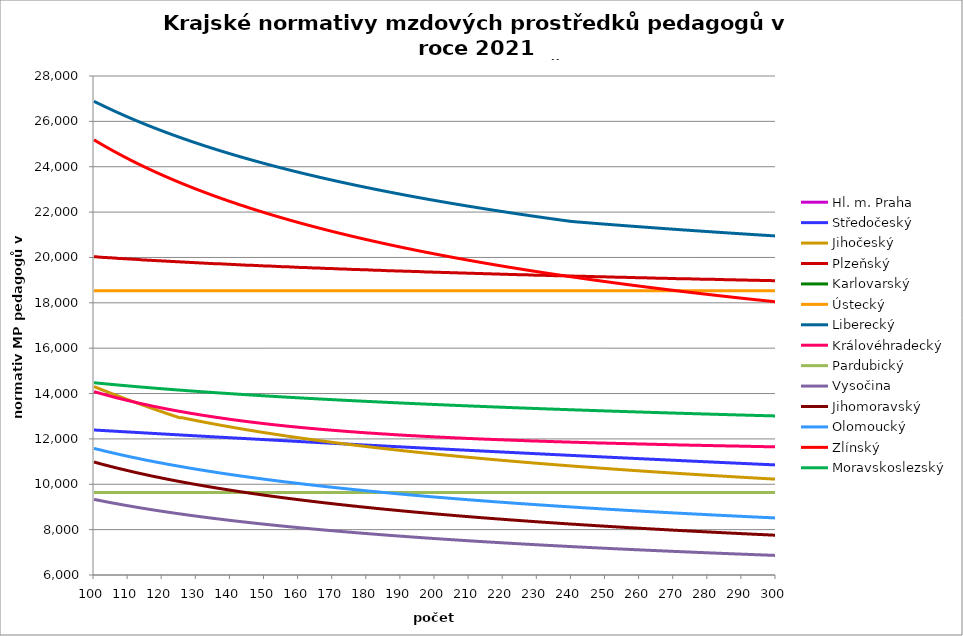
| Category | Hl. m. Praha | Středočeský | Jihočeský | Plzeňský | Karlovarský  | Ústecký   | Liberecký | Královéhradecký | Pardubický | Vysočina | Jihomoravský | Olomoucký | Zlínský | Moravskoslezský |
|---|---|---|---|---|---|---|---|---|---|---|---|---|---|---|
| 100.0 | 30242.815 | 12393.089 | 14307.025 | 20032.345 | 31680 | 18530.318 | 26885.263 | 14086.59 | 9638.914 | 9334.496 | 10981.179 | 11582.286 | 25185.836 | 14476.756 |
| 101.0 | 30242.815 | 12384.295 | 14246.784 | 20024.208 | 31680 | 18530.318 | 26810.474 | 14043.161 | 9638.914 | 9304.116 | 10940.705 | 11543.806 | 25095.861 | 14462.008 |
| 102.0 | 30242.815 | 12375.514 | 14187.047 | 20007.955 | 31680 | 18530.318 | 26736.831 | 14000 | 9638.914 | 9274.276 | 10898.027 | 11508.304 | 25007.403 | 14447.436 |
| 103.0 | 30242.815 | 12366.745 | 14127.81 | 19999.838 | 31680 | 18530.318 | 26664.304 | 13960.992 | 9638.914 | 9244.965 | 10858.162 | 11470.314 | 24920.421 | 14433.035 |
| 104.0 | 30242.815 | 12357.989 | 14069.065 | 19991.727 | 31680 | 18530.318 | 26592.865 | 13918.333 | 9638.914 | 9215.84 | 10821.053 | 11435.261 | 24834.874 | 14418.801 |
| 105.0 | 30242.815 | 12349.245 | 14010.807 | 19983.624 | 31680 | 18530.318 | 26522.485 | 13879.778 | 9638.914 | 9187.568 | 10781.748 | 11400.422 | 24750.722 | 14404.73 |
| 106.0 | 30242.815 | 12340.514 | 13953.029 | 19975.527 | 31680 | 18530.318 | 26453.139 | 13837.614 | 9638.914 | 9159.47 | 10742.728 | 11365.794 | 24667.928 | 14390.821 |
| 107.0 | 30242.815 | 12331.795 | 13895.726 | 19959.352 | 31680 | 18530.318 | 26384.801 | 13799.504 | 9638.914 | 9131.874 | 10706.402 | 11331.377 | 24586.456 | 14377.068 |
| 108.0 | 30242.815 | 12323.088 | 13838.892 | 19951.275 | 31680 | 18530.318 | 26317.445 | 13761.604 | 9638.914 | 9104.774 | 10670.321 | 11297.167 | 24506.271 | 14363.469 |
| 109.0 | 30242.815 | 12314.393 | 13782.52 | 19943.204 | 31680 | 18530.318 | 26251.049 | 13723.911 | 9638.914 | 9077.834 | 10634.483 | 11263.163 | 24427.338 | 14350.021 |
| 110.0 | 30242.815 | 12305.711 | 13726.606 | 19935.14 | 31680 | 18530.318 | 26185.589 | 13690.164 | 9638.914 | 9051.704 | 10598.884 | 11231.956 | 24349.627 | 14336.721 |
| 111.0 | 30242.815 | 12297.041 | 13671.144 | 19927.082 | 31680 | 18530.318 | 26121.042 | 13652.861 | 9638.914 | 9025.724 | 10563.523 | 11198.343 | 24273.105 | 14323.565 |
| 112.0 | 30242.815 | 12288.383 | 13616.128 | 19919.03 | 31680 | 18530.318 | 26057.388 | 13619.462 | 9638.914 | 9000.054 | 10528.397 | 11167.493 | 24197.743 | 14310.551 |
| 113.0 | 30242.815 | 12279.737 | 13561.554 | 19910.985 | 31680 | 18530.318 | 25994.604 | 13582.543 | 9638.914 | 8974.689 | 10493.504 | 11136.813 | 24123.511 | 14297.676 |
| 114.0 | 30242.815 | 12271.104 | 13507.415 | 19894.915 | 31680 | 18530.318 | 25932.672 | 13549.486 | 9638.914 | 8949.945 | 10461.145 | 11103.766 | 24050.381 | 14284.937 |
| 115.0 | 30242.815 | 12262.482 | 13453.706 | 19886.89 | 31680 | 18530.318 | 25871.571 | 13516.59 | 9638.914 | 8925.495 | 10428.986 | 11073.435 | 23978.325 | 14272.332 |
| 116.0 | 30242.815 | 12253.873 | 13400.423 | 19878.871 | 31680 | 18530.318 | 25811.283 | 13483.854 | 9638.914 | 8901.336 | 10394.747 | 11043.269 | 23907.319 | 14259.858 |
| 117.0 | 30242.815 | 12245.276 | 13347.56 | 19870.859 | 31680 | 18530.318 | 25751.789 | 13451.275 | 9638.914 | 8877.464 | 10362.994 | 11015.761 | 23837.336 | 14247.512 |
| 118.0 | 30242.815 | 12236.691 | 13295.113 | 19862.853 | 31680 | 18530.318 | 25693.071 | 13422.448 | 9638.914 | 8854.031 | 10331.434 | 10985.908 | 23768.352 | 14235.293 |
| 119.0 | 30242.815 | 12228.118 | 13243.076 | 19854.853 | 31680 | 18530.318 | 25635.113 | 13390.166 | 9638.914 | 8830.876 | 10302.299 | 10956.216 | 23700.343 | 14223.197 |
| 120.0 | 30242.815 | 12219.557 | 13191.446 | 19846.86 | 31680 | 18530.318 | 25577.897 | 13361.6 | 9638.914 | 8807.997 | 10271.107 | 10929.14 | 23633.287 | 14211.223 |
| 121.0 | 30242.815 | 12211.007 | 13140.216 | 19838.873 | 31680 | 18530.318 | 25521.408 | 13329.609 | 9638.914 | 8785.389 | 10240.103 | 10899.754 | 23567.161 | 14199.369 |
| 122.0 | 30242.815 | 12202.47 | 13089.382 | 19830.893 | 31680 | 18530.318 | 25465.63 | 13301.301 | 9638.914 | 8763.202 | 10211.481 | 10872.955 | 23501.943 | 14187.631 |
| 123.0 | 30242.815 | 12193.945 | 13038.94 | 19822.919 | 31680 | 18530.318 | 25410.547 | 13273.113 | 9638.914 | 8741.127 | 10180.836 | 10846.288 | 23437.614 | 14176.008 |
| 124.0 | 30242.815 | 12185.432 | 12988.886 | 19814.952 | 31680 | 18530.318 | 25356.145 | 13245.044 | 9638.914 | 8719.465 | 10152.544 | 10819.751 | 23374.152 | 14164.498 |
| 125.0 | 30242.815 | 12176.93 | 12939.214 | 19806.991 | 31680 | 18530.318 | 25302.41 | 13217.093 | 9638.914 | 8698.211 | 10124.408 | 10793.344 | 23311.539 | 14153.1 |
| 126.0 | 30242.815 | 12168.441 | 12929.001 | 19799.036 | 31680 | 18530.318 | 25249.328 | 13192.733 | 9638.914 | 8676.91 | 10096.429 | 10767.065 | 23249.755 | 14141.81 |
| 127.0 | 30242.815 | 12159.963 | 12897.924 | 19791.088 | 31680 | 18530.318 | 25196.885 | 13165.003 | 9638.914 | 8656.161 | 10068.603 | 10740.914 | 23188.782 | 14130.627 |
| 128.0 | 30242.815 | 12151.497 | 12867.238 | 19783.146 | 31680 | 18530.318 | 25145.068 | 13137.389 | 9638.914 | 8635.51 | 10040.93 | 10714.89 | 23128.603 | 14119.549 |
| 129.0 | 30242.815 | 12143.043 | 12836.936 | 19775.211 | 31680 | 18530.318 | 25093.864 | 13113.321 | 9638.914 | 8615.105 | 10013.409 | 10688.991 | 23069.2 | 14108.575 |
| 130.0 | 30242.815 | 12134.6 | 12807.008 | 19767.281 | 31680 | 18530.318 | 25043.262 | 13089.342 | 9638.914 | 8595.237 | 9988.139 | 10665.556 | 23010.557 | 14097.702 |
| 131.0 | 30242.815 | 12126.17 | 12777.446 | 19759.359 | 31680 | 18530.318 | 24993.248 | 13065.45 | 9638.914 | 8575.168 | 9960.906 | 10639.895 | 22952.657 | 14086.929 |
| 132.0 | 30242.815 | 12117.751 | 12748.245 | 19751.442 | 31680 | 18530.318 | 24943.813 | 13038.251 | 9638.914 | 8555.629 | 9935.9 | 10616.674 | 22895.485 | 14076.254 |
| 133.0 | 30242.815 | 12109.343 | 12719.395 | 19743.532 | 31680 | 18530.318 | 24894.943 | 13017.927 | 9638.914 | 8536.324 | 9908.951 | 10591.248 | 22839.025 | 14065.676 |
| 134.0 | 30242.815 | 12100.948 | 12690.89 | 19735.629 | 31680 | 18530.318 | 24846.628 | 12994.295 | 9638.914 | 8517.25 | 9884.204 | 10568.238 | 22783.262 | 14055.193 |
| 135.0 | 30242.815 | 12092.564 | 12662.723 | 19727.731 | 31680 | 18530.318 | 24798.858 | 12970.748 | 9638.914 | 8498.26 | 9859.581 | 10545.328 | 22728.183 | 14044.803 |
| 136.0 | 30242.815 | 12084.191 | 12634.888 | 19719.84 | 31680 | 18530.318 | 24751.621 | 12947.287 | 9638.914 | 8479.641 | 9835.08 | 10520.242 | 22673.773 | 14034.505 |
| 137.0 | 30242.815 | 12075.83 | 12607.377 | 19719.84 | 31680 | 18530.318 | 24704.908 | 12927.245 | 9638.914 | 8461.246 | 9810.7 | 10497.54 | 22620.019 | 14024.297 |
| 138.0 | 30242.815 | 12067.481 | 12580.185 | 19711.955 | 31680 | 18530.318 | 24658.709 | 12903.94 | 9638.914 | 8442.93 | 9786.441 | 10474.935 | 22566.907 | 14014.179 |
| 139.0 | 30242.815 | 12059.143 | 12553.304 | 19704.077 | 31680 | 18530.318 | 24613.014 | 12884.032 | 9638.914 | 8424.835 | 9762.302 | 10452.428 | 22514.425 | 14004.147 |
| 140.0 | 30242.815 | 12050.817 | 12526.73 | 19696.205 | 31680 | 18530.318 | 24567.814 | 12860.883 | 9638.914 | 8406.958 | 9738.282 | 10430.017 | 22462.56 | 13994.202 |
| 141.0 | 30242.815 | 12042.502 | 12500.456 | 19688.339 | 31680 | 18530.318 | 24523.1 | 12841.107 | 9638.914 | 8389.296 | 9716.367 | 10409.929 | 22411.3 | 13984.342 |
| 142.0 | 30242.815 | 12034.199 | 12474.477 | 19680.479 | 31680 | 18530.318 | 24478.862 | 12821.392 | 9638.914 | 8371.986 | 9692.571 | 10387.7 | 22360.633 | 13974.565 |
| 143.0 | 30242.815 | 12025.907 | 12448.786 | 19672.626 | 31680 | 18530.318 | 24435.093 | 12801.737 | 9638.914 | 8354.609 | 9668.893 | 10365.566 | 22310.548 | 13964.87 |
| 144.0 | 30242.815 | 12017.627 | 12423.379 | 19664.779 | 31680 | 18530.318 | 24391.783 | 12782.143 | 9638.914 | 8337.719 | 9647.288 | 10345.725 | 22261.034 | 13955.256 |
| 145.0 | 30242.815 | 12009.358 | 12398.25 | 19656.938 | 31680 | 18530.318 | 24348.924 | 12762.608 | 9638.914 | 8320.759 | 9625.78 | 10323.769 | 22212.079 | 13945.722 |
| 146.0 | 30242.815 | 12001.1 | 12373.394 | 19656.938 | 31680 | 18530.318 | 24306.509 | 12743.133 | 9638.914 | 8304.143 | 9602.426 | 10304.088 | 22163.673 | 13936.266 |
| 147.0 | 30242.815 | 11992.854 | 12348.807 | 19649.103 | 31680 | 18530.318 | 24264.529 | 12726.949 | 9638.914 | 8287.592 | 9581.118 | 10282.308 | 22115.806 | 13926.887 |
| 148.0 | 30242.815 | 11984.619 | 12324.482 | 19641.275 | 31680 | 18530.318 | 24222.978 | 12707.583 | 9638.914 | 8271.243 | 9559.903 | 10262.785 | 22068.468 | 13917.585 |
| 149.0 | 30242.815 | 11976.395 | 12300.417 | 19633.453 | 31680 | 18530.318 | 24181.846 | 12691.489 | 9638.914 | 8255.094 | 9538.783 | 10243.335 | 22021.649 | 13908.357 |
| 150.0 | 30242.815 | 11968.183 | 12276.605 | 19625.637 | 31680 | 18530.318 | 24141.128 | 12672.231 | 9638.914 | 8239.143 | 9517.756 | 10221.811 | 21975.339 | 13899.203 |
| 151.0 | 30242.815 | 11959.982 | 12253.042 | 19617.827 | 31680 | 18530.318 | 24100.816 | 12656.226 | 9638.914 | 8223.388 | 9496.821 | 10202.517 | 21929.53 | 13890.122 |
| 152.0 | 30242.815 | 11951.792 | 12229.724 | 19617.827 | 31680 | 18530.318 | 24060.903 | 12637.074 | 9638.914 | 8207.559 | 9475.978 | 10183.295 | 21884.211 | 13881.113 |
| 153.0 | 30242.815 | 11943.613 | 12206.647 | 19610.024 | 31680 | 18530.318 | 24021.383 | 12621.159 | 9638.914 | 8192.191 | 9457.109 | 10164.145 | 21839.375 | 13872.174 |
| 154.0 | 30242.815 | 11935.446 | 12183.806 | 19602.227 | 31680 | 18530.318 | 23982.248 | 12605.283 | 9638.914 | 8176.881 | 9436.439 | 10145.068 | 21795.012 | 13863.305 |
| 155.0 | 30242.815 | 11927.289 | 12161.198 | 19594.436 | 31680 | 18530.318 | 23943.493 | 12589.447 | 9638.914 | 8161.627 | 9415.86 | 10126.062 | 21751.115 | 13854.504 |
| 156.0 | 30242.815 | 11919.144 | 12138.818 | 19586.651 | 31680 | 18530.318 | 23905.111 | 12573.651 | 9638.914 | 8146.695 | 9397.23 | 10107.127 | 21707.674 | 13845.771 |
| 157.0 | 30242.815 | 11911.01 | 12116.662 | 19586.651 | 31680 | 18530.318 | 23867.096 | 12557.895 | 9638.914 | 8131.816 | 9376.821 | 10090.355 | 21664.683 | 13837.105 |
| 158.0 | 30242.815 | 11902.887 | 12094.727 | 19578.872 | 31680 | 18530.318 | 23829.441 | 12542.178 | 9638.914 | 8117.123 | 9358.345 | 10071.553 | 21622.133 | 13828.505 |
| 159.0 | 30242.815 | 11894.775 | 12073.009 | 19571.1 | 31680 | 18530.318 | 23792.142 | 12529.632 | 9638.914 | 8102.353 | 9339.941 | 10052.821 | 21580.017 | 13819.969 |
| 160.0 | 30242.815 | 11886.674 | 12051.504 | 19563.333 | 31680 | 18530.318 | 23755.192 | 12513.986 | 9638.914 | 8088.156 | 9319.78 | 10036.229 | 21538.327 | 13811.498 |
| 161.0 | 30242.815 | 11878.584 | 12030.209 | 19555.573 | 31680 | 18530.318 | 23718.586 | 12498.379 | 9638.914 | 8073.75 | 9301.528 | 10017.628 | 21497.056 | 13803.089 |
| 162.0 | 30242.815 | 11870.506 | 12009.12 | 19555.573 | 31680 | 18530.318 | 23682.318 | 12485.921 | 9638.914 | 8059.653 | 9283.346 | 9999.096 | 21456.197 | 13794.743 |
| 163.0 | 30242.815 | 11862.438 | 11988.234 | 19547.819 | 31680 | 18530.318 | 23646.383 | 12470.383 | 9638.914 | 8045.605 | 9265.236 | 9982.68 | 21415.743 | 13786.458 |
| 164.0 | 30242.815 | 11854.381 | 11967.548 | 19540.071 | 31680 | 18530.318 | 23610.776 | 12457.981 | 9638.914 | 8031.734 | 9247.196 | 9966.318 | 21375.688 | 13778.233 |
| 165.0 | 30242.815 | 11846.335 | 11947.058 | 19532.33 | 31680 | 18530.318 | 23575.491 | 12445.604 | 9638.914 | 8018.039 | 9229.227 | 9947.975 | 21336.024 | 13770.069 |
| 166.0 | 30242.815 | 11838.3 | 11926.762 | 19532.33 | 31680 | 18530.318 | 23540.524 | 12430.166 | 9638.914 | 8004.391 | 9211.327 | 9931.727 | 21296.745 | 13761.963 |
| 167.0 | 30242.815 | 11830.276 | 11906.655 | 19524.594 | 31680 | 18530.318 | 23505.87 | 12417.844 | 9638.914 | 7990.789 | 9193.496 | 9915.532 | 21257.845 | 13753.915 |
| 168.0 | 30242.815 | 11822.262 | 11886.736 | 19516.865 | 31680 | 18530.318 | 23471.523 | 12405.546 | 9638.914 | 7977.486 | 9175.734 | 9897.375 | 21219.319 | 13745.925 |
| 169.0 | 30242.815 | 11814.26 | 11867.001 | 19509.141 | 31680 | 18530.318 | 23437.48 | 12393.272 | 9638.914 | 7964.101 | 9159.807 | 9881.292 | 21181.158 | 13737.991 |
| 170.0 | 30242.815 | 11806.268 | 11847.447 | 19509.141 | 31680 | 18530.318 | 23403.735 | 12381.023 | 9638.914 | 7951.138 | 9142.175 | 9865.261 | 21143.359 | 13730.113 |
| 171.0 | 30242.815 | 11798.288 | 11828.071 | 19501.424 | 31680 | 18530.318 | 23370.284 | 12368.798 | 9638.914 | 7938.092 | 9124.611 | 9849.281 | 21105.915 | 13722.291 |
| 172.0 | 30242.815 | 11790.317 | 11808.871 | 19493.713 | 31680 | 18530.318 | 23337.123 | 12356.597 | 9638.914 | 7925.338 | 9108.861 | 9833.354 | 21068.821 | 13714.522 |
| 173.0 | 30242.815 | 11782.358 | 11789.844 | 19486.008 | 31680 | 18530.318 | 23304.247 | 12344.42 | 9638.914 | 7912.501 | 9091.424 | 9817.477 | 21032.071 | 13706.808 |
| 174.0 | 30242.815 | 11774.41 | 11770.988 | 19486.008 | 31680 | 18530.318 | 23271.653 | 12332.267 | 9638.914 | 7899.829 | 9075.788 | 9801.652 | 20995.659 | 13699.147 |
| 175.0 | 30242.815 | 11766.472 | 11752.299 | 19478.309 | 31680 | 18530.318 | 23239.335 | 12320.138 | 9638.914 | 7887.198 | 9058.478 | 9785.878 | 20959.581 | 13691.538 |
| 176.0 | 30242.815 | 11758.545 | 11733.776 | 19470.616 | 31680 | 18530.318 | 23207.291 | 12311.057 | 9638.914 | 7874.853 | 9042.955 | 9770.155 | 20923.831 | 13683.98 |
| 177.0 | 30242.815 | 11750.628 | 11715.415 | 19470.616 | 31680 | 18530.318 | 23175.516 | 12298.969 | 9638.914 | 7862.547 | 9027.485 | 9756.438 | 20888.404 | 13676.474 |
| 178.0 | 30242.815 | 11742.723 | 11697.215 | 19462.929 | 31680 | 18530.318 | 23144.005 | 12286.905 | 9638.914 | 7850.28 | 9010.359 | 9740.809 | 20853.296 | 13669.018 |
| 179.0 | 30242.815 | 11734.827 | 11679.172 | 19455.249 | 31680 | 18530.318 | 23112.757 | 12277.873 | 9638.914 | 7838.173 | 8995 | 9725.23 | 20818.501 | 13661.612 |
| 180.0 | 30242.815 | 11726.943 | 11661.285 | 19455.249 | 31680 | 18530.318 | 23081.766 | 12265.851 | 9638.914 | 7826.103 | 8979.694 | 9709.701 | 20784.015 | 13654.256 |
| 181.0 | 30242.815 | 11719.069 | 11643.552 | 19447.574 | 31680 | 18530.318 | 23051.028 | 12256.849 | 9638.914 | 7814.313 | 8964.439 | 9696.153 | 20749.834 | 13646.948 |
| 182.0 | 30242.815 | 11711.206 | 11625.97 | 19439.905 | 31680 | 18530.318 | 23020.542 | 12247.861 | 9638.914 | 7802.438 | 8949.237 | 9680.716 | 20715.951 | 13639.688 |
| 183.0 | 30242.815 | 11703.353 | 11608.536 | 19432.243 | 31680 | 18530.318 | 22990.302 | 12235.897 | 9638.914 | 7790.719 | 8934.086 | 9667.25 | 20682.364 | 13632.475 |
| 184.0 | 30242.815 | 11695.51 | 11591.249 | 19432.243 | 31680 | 18530.318 | 22960.306 | 12226.94 | 9638.914 | 7779.156 | 8918.986 | 9651.905 | 20649.068 | 13625.309 |
| 185.0 | 30242.815 | 11687.679 | 11574.108 | 19424.586 | 31680 | 18530.318 | 22930.549 | 12217.996 | 9638.914 | 7767.626 | 8903.937 | 9638.518 | 20616.059 | 13618.19 |
| 186.0 | 30242.815 | 11679.857 | 11557.108 | 19416.936 | 31680 | 18530.318 | 22901.03 | 12209.064 | 9638.914 | 7756.251 | 8888.939 | 9623.264 | 20583.332 | 13611.116 |
| 187.0 | 30242.815 | 11672.046 | 11540.249 | 19416.936 | 31680 | 18530.318 | 22871.744 | 12197.176 | 9638.914 | 7745.028 | 8875.649 | 9609.957 | 20550.884 | 13604.087 |
| 188.0 | 30242.815 | 11664.246 | 11523.529 | 19409.291 | 31680 | 18530.318 | 22842.689 | 12188.275 | 9638.914 | 7733.837 | 8860.746 | 9594.793 | 20518.709 | 13597.104 |
| 189.0 | 30242.815 | 11656.456 | 11506.946 | 19401.653 | 31680 | 18530.318 | 22813.861 | 12179.387 | 9638.914 | 7722.679 | 8845.893 | 9581.564 | 20486.806 | 13590.164 |
| 190.0 | 30242.815 | 11648.676 | 11490.497 | 19401.653 | 31680 | 18530.318 | 22785.257 | 12170.513 | 9638.914 | 7711.553 | 8832.732 | 9568.371 | 20455.169 | 13583.268 |
| 191.0 | 30242.815 | 11640.907 | 11474.182 | 19394.02 | 31680 | 18530.318 | 22756.874 | 12161.65 | 9638.914 | 7700.577 | 8817.973 | 9555.215 | 20423.795 | 13576.415 |
| 192.0 | 30242.815 | 11633.148 | 11457.997 | 19386.394 | 31680 | 18530.318 | 22728.71 | 12152.801 | 9638.914 | 7689.632 | 8803.262 | 9540.224 | 20392.68 | 13569.605 |
| 193.0 | 30242.815 | 11625.4 | 11441.942 | 19386.394 | 31680 | 18530.318 | 22700.761 | 12143.965 | 9638.914 | 7678.952 | 8790.228 | 9527.145 | 20361.82 | 13562.837 |
| 194.0 | 30242.815 | 11617.661 | 11426.014 | 19378.774 | 31680 | 18530.318 | 22673.025 | 12138.081 | 9638.914 | 7668.186 | 8775.61 | 9514.101 | 20331.213 | 13556.11 |
| 195.0 | 30242.815 | 11609.933 | 11410.213 | 19378.774 | 31680 | 18530.318 | 22645.498 | 12129.267 | 9638.914 | 7657.682 | 8762.657 | 9501.094 | 20300.854 | 13549.425 |
| 196.0 | 30242.815 | 11602.216 | 11394.535 | 19371.159 | 31680 | 18530.318 | 22618.179 | 12120.464 | 9638.914 | 7647.091 | 8749.742 | 9488.122 | 20270.74 | 13542.781 |
| 197.0 | 30242.815 | 11594.508 | 11378.98 | 19363.551 | 31680 | 18530.318 | 22591.063 | 12111.675 | 9638.914 | 7636.761 | 8735.258 | 9475.185 | 20240.868 | 13536.177 |
| 198.0 | 30242.815 | 11586.811 | 11363.545 | 19363.551 | 31680 | 18530.318 | 22564.15 | 12105.823 | 9638.914 | 7626.343 | 8722.424 | 9462.284 | 20211.235 | 13529.612 |
| 199.0 | 30242.815 | 11579.124 | 11348.23 | 19355.948 | 31680 | 18530.318 | 22537.436 | 12097.055 | 9638.914 | 7616.069 | 8709.628 | 9449.417 | 20181.836 | 13523.087 |
| 200.0 | 30242.815 | 11571.448 | 11333.033 | 19348.352 | 31680 | 18530.318 | 22510.918 | 12088.299 | 9638.914 | 7605.823 | 8695.276 | 9436.586 | 20152.67 | 13516.601 |
| 201.0 | 30242.815 | 11563.781 | 11317.951 | 19348.352 | 31680 | 18530.318 | 22484.594 | 12082.469 | 9638.914 | 7595.719 | 8682.559 | 9423.789 | 20123.733 | 13510.154 |
| 202.0 | 30242.815 | 11556.124 | 11302.985 | 19340.761 | 31680 | 18530.318 | 22458.462 | 12073.735 | 9638.914 | 7585.756 | 8669.88 | 9412.848 | 20095.022 | 13503.744 |
| 203.0 | 30242.815 | 11548.478 | 11288.131 | 19340.761 | 31680 | 18530.318 | 22432.52 | 12067.919 | 9638.914 | 7575.705 | 8657.237 | 9400.116 | 20066.534 | 13497.373 |
| 204.0 | 30242.815 | 11540.842 | 11273.389 | 19333.176 | 31680 | 18530.318 | 22406.764 | 12059.206 | 9638.914 | 7565.794 | 8644.631 | 9387.418 | 20038.266 | 13491.038 |
| 205.0 | 30242.815 | 11533.216 | 11258.758 | 19325.598 | 31680 | 18530.318 | 22381.193 | 12053.404 | 9638.914 | 7556.023 | 8632.061 | 9374.754 | 20010.215 | 13484.741 |
| 206.0 | 30242.815 | 11525.6 | 11244.235 | 19325.598 | 31680 | 18530.318 | 22355.804 | 12044.712 | 9638.914 | 7546.277 | 8619.528 | 9363.927 | 19982.379 | 13478.48 |
| 207.0 | 30242.815 | 11517.994 | 11229.82 | 19318.025 | 31680 | 18530.318 | 22330.595 | 12038.924 | 9638.914 | 7536.556 | 8607.032 | 9351.326 | 19954.754 | 13472.255 |
| 208.0 | 30242.815 | 11510.398 | 11215.511 | 19310.458 | 31680 | 18530.318 | 22305.564 | 12033.141 | 9638.914 | 7526.972 | 8594.571 | 9338.76 | 19927.338 | 13466.065 |
| 209.0 | 30242.815 | 11502.812 | 11201.307 | 19310.458 | 31680 | 18530.318 | 22280.709 | 12024.478 | 9638.914 | 7517.413 | 8582.147 | 9328.015 | 19900.128 | 13459.911 |
| 210.0 | 30242.815 | 11495.236 | 11187.206 | 19302.897 | 31680 | 18530.318 | 22256.028 | 12018.71 | 9638.914 | 7507.991 | 8569.758 | 9315.511 | 19873.121 | 13453.792 |
| 211.0 | 30242.815 | 11487.67 | 11173.207 | 19302.897 | 31680 | 18530.318 | 22231.517 | 12012.947 | 9638.914 | 7498.592 | 8558.948 | 9304.82 | 19846.316 | 13447.708 |
| 212.0 | 30242.815 | 11480.114 | 11159.309 | 19295.342 | 31680 | 18530.318 | 22207.177 | 12007.189 | 9638.914 | 7489.327 | 8546.626 | 9292.378 | 19819.709 | 13441.658 |
| 213.0 | 30242.815 | 11472.568 | 11145.511 | 19295.342 | 31680 | 18530.318 | 22183.004 | 11998.563 | 9638.914 | 7480.086 | 8534.34 | 9281.74 | 19793.298 | 13435.641 |
| 214.0 | 30242.815 | 11465.032 | 11131.812 | 19287.793 | 31680 | 18530.318 | 22158.996 | 11992.82 | 9638.914 | 7470.757 | 8522.089 | 9269.36 | 19767.081 | 13429.659 |
| 215.0 | 30242.815 | 11457.505 | 11118.209 | 19280.25 | 31680 | 18530.318 | 22135.151 | 11987.081 | 9638.914 | 7461.672 | 8511.398 | 9258.774 | 19741.054 | 13423.709 |
| 216.0 | 30242.815 | 11449.989 | 11104.703 | 19280.25 | 31680 | 18530.318 | 22111.468 | 11981.349 | 9638.914 | 7452.609 | 8499.213 | 9246.455 | 19715.217 | 13417.792 |
| 217.0 | 30242.815 | 11442.483 | 11091.292 | 19272.713 | 31680 | 18530.318 | 22087.945 | 11975.621 | 9638.914 | 7443.678 | 8488.579 | 9235.922 | 19689.566 | 13411.908 |
| 218.0 | 30242.815 | 11434.986 | 11077.975 | 19272.713 | 31680 | 18530.318 | 22064.58 | 11969.9 | 9638.914 | 7434.659 | 8476.459 | 9225.412 | 19664.099 | 13406.056 |
| 219.0 | 30242.815 | 11427.499 | 11064.75 | 19265.182 | 31680 | 18530.318 | 22041.37 | 11964.183 | 9638.914 | 7425.881 | 8465.882 | 9213.182 | 19638.813 | 13400.236 |
| 220.0 | 30242.815 | 11420.022 | 11051.617 | 19257.656 | 31680 | 18530.318 | 22018.315 | 11958.473 | 9638.914 | 7416.905 | 8453.827 | 9202.724 | 19613.708 | 13394.447 |
| 221.0 | 30242.815 | 11412.554 | 11038.574 | 19257.656 | 31680 | 18530.318 | 21995.412 | 11952.767 | 9638.914 | 7408.278 | 8443.307 | 9192.29 | 19588.78 | 13388.69 |
| 222.0 | 30242.815 | 11405.097 | 11025.62 | 19250.137 | 31680 | 18530.318 | 21972.66 | 11947.067 | 9638.914 | 7399.562 | 8431.315 | 9181.88 | 19564.028 | 13382.963 |
| 223.0 | 30242.815 | 11397.649 | 11012.756 | 19250.137 | 31680 | 18530.318 | 21950.057 | 11941.373 | 9638.914 | 7390.866 | 8420.851 | 9169.764 | 19539.448 | 13377.267 |
| 224.0 | 30242.815 | 11390.211 | 10999.978 | 19242.623 | 31680 | 18530.318 | 21927.601 | 11935.684 | 9638.914 | 7382.408 | 8410.413 | 9159.405 | 19515.04 | 13371.601 |
| 225.0 | 30242.815 | 11382.783 | 10987.287 | 19242.623 | 31680 | 18530.318 | 21905.291 | 11930 | 9638.914 | 7373.861 | 8398.515 | 9149.069 | 19490.802 | 13365.966 |
| 226.0 | 30242.815 | 11375.364 | 10974.681 | 19235.115 | 31680 | 18530.318 | 21883.125 | 11924.322 | 9638.914 | 7365.333 | 8388.131 | 9138.756 | 19466.73 | 13360.36 |
| 227.0 | 30242.815 | 11367.955 | 10962.159 | 19235.115 | 31680 | 18530.318 | 21861.101 | 11918.649 | 9638.914 | 7357.041 | 8377.774 | 9128.467 | 19442.824 | 13354.783 |
| 228.0 | 30242.815 | 11360.555 | 10949.721 | 19227.613 | 31680 | 18530.318 | 21839.218 | 11912.981 | 9638.914 | 7348.659 | 8367.442 | 9118.201 | 19419.081 | 13349.236 |
| 229.0 | 30242.815 | 11353.166 | 10937.365 | 19220.117 | 31680 | 18530.318 | 21817.474 | 11910.15 | 9638.914 | 7340.297 | 8355.665 | 9107.957 | 19395.499 | 13343.717 |
| 230.0 | 30242.815 | 11345.785 | 10925.091 | 19220.117 | 31680 | 18530.318 | 21795.868 | 11904.49 | 9638.914 | 7332.061 | 8345.387 | 9097.737 | 19372.078 | 13338.227 |
| 231.0 | 30242.815 | 11338.415 | 10912.898 | 19212.627 | 31680 | 18530.318 | 21774.398 | 11898.836 | 9638.914 | 7323.949 | 8335.135 | 9087.54 | 19348.813 | 13332.766 |
| 232.0 | 30242.815 | 11331.054 | 10900.784 | 19212.627 | 31680 | 18530.318 | 21753.063 | 11893.188 | 9638.914 | 7315.856 | 8324.908 | 9077.365 | 19325.705 | 13327.332 |
| 233.0 | 30242.815 | 11323.702 | 10888.748 | 19205.142 | 31680 | 18530.318 | 21731.861 | 11890.365 | 9638.914 | 7307.674 | 8314.706 | 9067.213 | 19302.751 | 13321.926 |
| 234.0 | 30242.815 | 11316.36 | 10876.791 | 19205.142 | 31680 | 18530.318 | 21710.791 | 11884.725 | 9638.914 | 7299.723 | 8304.529 | 9057.084 | 19279.95 | 13316.548 |
| 235.0 | 30242.815 | 11309.028 | 10864.911 | 19197.664 | 31680 | 18530.318 | 21689.851 | 11879.09 | 9638.914 | 7291.683 | 8294.377 | 9046.978 | 19257.299 | 13311.197 |
| 236.0 | 30242.815 | 11301.705 | 10853.107 | 19197.664 | 31680 | 18530.318 | 21669.04 | 11876.274 | 9638.914 | 7283.766 | 8284.249 | 9036.894 | 19234.797 | 13305.873 |
| 237.0 | 30242.815 | 11294.392 | 10841.379 | 19190.191 | 31680 | 18530.318 | 21648.357 | 11870.647 | 9638.914 | 7275.867 | 8274.146 | 9026.832 | 19212.442 | 13300.575 |
| 238.0 | 30242.815 | 11287.088 | 10829.724 | 19190.191 | 31680 | 18530.318 | 21627.801 | 11865.025 | 9638.914 | 7268.089 | 8264.068 | 9018.465 | 19190.233 | 13295.304 |
| 239.0 | 30242.815 | 11279.793 | 10818.144 | 19182.724 | 31680 | 18530.318 | 21607.369 | 11862.216 | 9638.914 | 7260.223 | 8254.015 | 9008.444 | 19168.168 | 13290.06 |
| 240.0 | 30242.815 | 11272.508 | 10806.637 | 19182.724 | 31680 | 18530.318 | 21587.061 | 11856.602 | 9638.914 | 7252.584 | 8243.985 | 8998.446 | 19146.246 | 13284.841 |
| 241.0 | 30242.815 | 11265.232 | 10795.202 | 19175.263 | 31680 | 18530.318 | 21574.772 | 11853.797 | 9638.914 | 7244.96 | 8235.408 | 8988.47 | 19124.465 | 13279.648 |
| 242.0 | 30242.815 | 11257.966 | 10783.838 | 19175.263 | 31680 | 18530.318 | 21562.547 | 11848.191 | 9638.914 | 7237.353 | 8225.424 | 8980.174 | 19102.823 | 13274.481 |
| 243.0 | 30242.815 | 11250.709 | 10772.544 | 19167.807 | 31680 | 18530.318 | 21550.387 | 11842.59 | 9638.914 | 7229.657 | 8215.464 | 8970.238 | 19081.319 | 13269.339 |
| 244.0 | 30242.815 | 11243.461 | 10761.321 | 19167.807 | 31680 | 18530.318 | 21538.291 | 11839.792 | 9638.914 | 7222.186 | 8205.529 | 8960.324 | 19059.951 | 13264.222 |
| 245.0 | 30242.815 | 11236.223 | 10750.167 | 19160.358 | 31680 | 18530.318 | 21526.257 | 11834.199 | 9638.914 | 7214.729 | 8197.031 | 8952.079 | 19038.718 | 13259.13 |
| 246.0 | 30242.815 | 11228.994 | 10739.081 | 19160.358 | 31680 | 18530.318 | 21514.286 | 11831.405 | 9638.914 | 7207.288 | 8187.14 | 8942.206 | 19017.619 | 13254.062 |
| 247.0 | 30242.815 | 11221.775 | 10728.063 | 19152.914 | 31680 | 18530.318 | 21502.377 | 11825.82 | 9638.914 | 7199.863 | 8177.273 | 8933.994 | 18996.651 | 13249.019 |
| 248.0 | 30242.815 | 11214.564 | 10717.112 | 19152.914 | 31680 | 18530.318 | 21490.528 | 11823.03 | 9638.914 | 7192.555 | 8168.834 | 8924.161 | 18975.815 | 13244 |
| 249.0 | 30242.815 | 11207.363 | 10706.227 | 19145.476 | 31680 | 18530.318 | 21478.741 | 11817.453 | 9638.914 | 7185.16 | 8159.01 | 8914.349 | 18955.107 | 13239.006 |
| 250.0 | 30242.815 | 11200.171 | 10695.407 | 19145.476 | 31680 | 18530.318 | 21467.013 | 11814.666 | 9638.914 | 7178.087 | 8150.609 | 8906.188 | 18934.527 | 13234.034 |
| 251.0 | 30242.815 | 11192.988 | 10684.653 | 19138.043 | 31680 | 18530.318 | 21455.345 | 11811.881 | 9638.914 | 7170.721 | 8140.83 | 8896.416 | 18914.074 | 13229.087 |
| 252.0 | 30242.815 | 11185.815 | 10673.963 | 19138.043 | 31680 | 18530.318 | 21443.737 | 11806.315 | 9638.914 | 7163.473 | 8132.466 | 8888.288 | 18893.746 | 13224.163 |
| 253.0 | 30242.815 | 11178.651 | 10663.336 | 19130.617 | 31680 | 18530.318 | 21432.186 | 11803.534 | 9638.914 | 7156.442 | 8122.73 | 8880.175 | 18873.542 | 13219.262 |
| 254.0 | 30242.815 | 11171.496 | 10652.772 | 19130.617 | 31680 | 18530.318 | 21420.694 | 11797.975 | 9638.914 | 7149.223 | 8114.403 | 8870.46 | 18853.461 | 13214.383 |
| 255.0 | 30242.815 | 11164.35 | 10642.271 | 19123.196 | 31680 | 18530.318 | 21409.258 | 11795.198 | 9638.914 | 7142.322 | 8104.71 | 8862.379 | 18833.501 | 13209.528 |
| 256.0 | 30242.815 | 11157.213 | 10631.831 | 19123.196 | 31680 | 18530.318 | 21397.88 | 11792.422 | 9638.914 | 7135.333 | 8096.42 | 8852.702 | 18813.661 | 13204.695 |
| 257.0 | 30242.815 | 11150.085 | 10621.452 | 19115.781 | 31680 | 18530.318 | 21386.558 | 11786.874 | 9638.914 | 7128.257 | 8086.77 | 8844.655 | 18793.94 | 13199.885 |
| 258.0 | 30242.815 | 11142.967 | 10611.134 | 19115.781 | 31680 | 18530.318 | 21375.292 | 11784.102 | 9638.914 | 7121.396 | 8078.517 | 8836.621 | 18774.336 | 13195.096 |
| 259.0 | 30242.815 | 11135.857 | 10600.876 | 19108.372 | 31680 | 18530.318 | 21364.082 | 11781.331 | 9638.914 | 7114.549 | 8070.28 | 8827.001 | 18754.849 | 13190.33 |
| 260.0 | 30242.815 | 11128.757 | 10590.677 | 19108.372 | 31680 | 18530.318 | 21352.926 | 11775.793 | 9638.914 | 7107.714 | 8060.692 | 8818.999 | 18735.478 | 13185.586 |
| 261.0 | 30242.815 | 11121.665 | 10580.536 | 19100.969 | 31680 | 18530.318 | 21341.825 | 11773.026 | 9638.914 | 7100.893 | 8052.492 | 8811.012 | 18716.22 | 13180.863 |
| 262.0 | 30242.815 | 11114.583 | 10570.453 | 19100.969 | 31680 | 18530.318 | 21330.777 | 11770.261 | 9638.914 | 7094.085 | 8044.309 | 8801.447 | 18697.075 | 13176.161 |
| 263.0 | 30242.815 | 11107.51 | 10560.428 | 19093.571 | 31680 | 18530.318 | 21319.783 | 11764.734 | 9638.914 | 7087.39 | 8034.783 | 8793.492 | 18678.043 | 13171.481 |
| 264.0 | 30242.815 | 11100.445 | 10550.46 | 19093.571 | 31680 | 18530.318 | 21308.842 | 11761.972 | 9638.914 | 7080.608 | 8026.635 | 8785.552 | 18659.121 | 13166.822 |
| 265.0 | 30242.815 | 11093.39 | 10540.549 | 19086.179 | 31680 | 18530.318 | 21297.954 | 11759.211 | 9638.914 | 7074.038 | 8018.504 | 8777.625 | 18640.308 | 13162.183 |
| 266.0 | 30242.815 | 11086.343 | 10530.693 | 19086.179 | 31680 | 18530.318 | 21287.117 | 11753.695 | 9638.914 | 7067.479 | 8010.39 | 8769.713 | 18621.604 | 13157.566 |
| 267.0 | 30242.815 | 11079.306 | 10520.892 | 19078.793 | 31680 | 18530.318 | 21276.333 | 11750.938 | 9638.914 | 7060.834 | 8002.291 | 8760.238 | 18603.008 | 13152.969 |
| 268.0 | 30242.815 | 11072.277 | 10511.147 | 19078.793 | 31680 | 18530.318 | 21265.599 | 11748.183 | 9638.914 | 7054.4 | 7994.21 | 8752.357 | 18584.518 | 13148.392 |
| 269.0 | 30242.815 | 11065.258 | 10501.455 | 19071.412 | 31680 | 18530.318 | 21254.916 | 11745.429 | 9638.914 | 7047.779 | 7984.802 | 8744.49 | 18566.133 | 13143.835 |
| 270.0 | 30242.815 | 11058.247 | 10491.817 | 19071.412 | 31680 | 18530.318 | 21244.284 | 11739.925 | 9638.914 | 7041.27 | 7976.755 | 8736.638 | 18547.853 | 13139.299 |
| 271.0 | 30242.815 | 11051.245 | 10482.233 | 19064.037 | 31680 | 18530.318 | 21233.701 | 11737.175 | 9638.914 | 7034.87 | 7968.725 | 8728.8 | 18529.676 | 13134.783 |
| 272.0 | 30242.815 | 11044.252 | 10472.701 | 19064.037 | 31680 | 18530.318 | 21223.168 | 11734.426 | 9638.914 | 7028.483 | 7960.711 | 8720.975 | 18511.601 | 13130.286 |
| 273.0 | 30242.815 | 11037.268 | 10463.221 | 19064.037 | 31680 | 18530.318 | 21212.684 | 11731.679 | 9638.914 | 7022.107 | 7952.713 | 8713.165 | 18493.628 | 13125.808 |
| 274.0 | 30242.815 | 11030.293 | 10453.793 | 19056.668 | 31680 | 18530.318 | 21202.248 | 11728.933 | 9638.914 | 7015.84 | 7944.731 | 8705.369 | 18475.755 | 13121.351 |
| 275.0 | 30242.815 | 11023.326 | 10444.416 | 19056.668 | 31680 | 18530.318 | 21191.861 | 11723.444 | 9638.914 | 7009.487 | 7936.765 | 8697.586 | 18457.982 | 13116.912 |
| 276.0 | 30242.815 | 11016.369 | 10435.09 | 19049.304 | 31680 | 18530.318 | 21181.522 | 11720.702 | 9638.914 | 7003.243 | 7928.815 | 8689.818 | 18440.307 | 13112.493 |
| 277.0 | 30242.815 | 11009.42 | 10425.814 | 19049.304 | 31680 | 18530.318 | 21171.23 | 11717.961 | 9638.914 | 6997.01 | 7920.881 | 8682.063 | 18422.729 | 13108.092 |
| 278.0 | 30242.815 | 11002.48 | 10416.588 | 19041.947 | 31680 | 18530.318 | 21160.984 | 11715.221 | 9638.914 | 6990.788 | 7914.281 | 8674.322 | 18405.248 | 13103.71 |
| 279.0 | 30242.815 | 10995.548 | 10407.412 | 19041.947 | 31680 | 18530.318 | 21150.786 | 11712.482 | 9638.914 | 6984.674 | 7906.376 | 8666.595 | 18387.863 | 13099.347 |
| 280.0 | 30242.815 | 10988.625 | 10398.284 | 19034.595 | 31680 | 18530.318 | 21140.634 | 11709.745 | 9638.914 | 6978.571 | 7898.487 | 8658.882 | 18370.573 | 13095.003 |
| 281.0 | 30242.815 | 10981.711 | 10389.205 | 19034.595 | 31680 | 18530.318 | 21130.528 | 11707.009 | 9638.914 | 6972.479 | 7890.613 | 8651.183 | 18353.377 | 13090.676 |
| 282.0 | 30242.815 | 10974.806 | 10380.174 | 19034.595 | 31680 | 18530.318 | 21120.467 | 11701.541 | 9638.914 | 6966.397 | 7882.755 | 8643.497 | 18336.274 | 13086.368 |
| 283.0 | 30242.815 | 10967.91 | 10371.19 | 19027.248 | 31680 | 18530.318 | 21110.451 | 11698.809 | 9638.914 | 6960.325 | 7874.913 | 8635.825 | 18319.263 | 13082.078 |
| 284.0 | 30242.815 | 10961.022 | 10362.253 | 19027.248 | 31680 | 18530.318 | 21100.481 | 11696.078 | 9638.914 | 6954.361 | 7868.39 | 8628.166 | 18302.343 | 13077.806 |
| 285.0 | 30242.815 | 10954.142 | 10353.364 | 19019.907 | 31680 | 18530.318 | 21090.554 | 11693.349 | 9638.914 | 6948.406 | 7860.576 | 8622.049 | 18285.514 | 13073.552 |
| 286.0 | 30242.815 | 10947.272 | 10344.52 | 19019.907 | 31680 | 18530.318 | 21080.672 | 11690.621 | 9638.914 | 6942.462 | 7852.778 | 8614.415 | 18268.775 | 13069.315 |
| 287.0 | 30242.815 | 10940.41 | 10335.723 | 19012.572 | 31680 | 18530.318 | 21070.833 | 11687.894 | 9638.914 | 6936.528 | 7844.995 | 8606.794 | 18252.125 | 13065.096 |
| 288.0 | 30242.815 | 10933.556 | 10326.97 | 19012.572 | 31680 | 18530.318 | 21061.038 | 11685.168 | 9638.914 | 6930.795 | 7838.521 | 8599.187 | 18235.562 | 13060.895 |
| 289.0 | 30242.815 | 10926.711 | 10318.263 | 19005.243 | 31680 | 18530.318 | 21051.286 | 11682.443 | 9638.914 | 6924.881 | 7830.767 | 8591.593 | 18219.087 | 13056.71 |
| 290.0 | 30242.815 | 10919.875 | 10309.601 | 19005.243 | 31680 | 18530.318 | 21041.576 | 11679.72 | 9638.914 | 6918.977 | 7823.028 | 8585.528 | 18202.699 | 13052.543 |
| 291.0 | 30242.815 | 10913.047 | 10300.983 | 19005.243 | 31680 | 18530.318 | 21031.909 | 11676.998 | 9638.914 | 6913.273 | 7816.59 | 8577.958 | 18186.396 | 13048.392 |
| 292.0 | 30242.815 | 10906.228 | 10292.409 | 18997.919 | 31680 | 18530.318 | 21022.284 | 11674.278 | 9638.914 | 6907.578 | 7808.879 | 8570.402 | 18170.178 | 13044.259 |
| 293.0 | 30242.815 | 10899.417 | 10283.878 | 18997.919 | 31680 | 18530.318 | 21012.7 | 11668.84 | 9638.914 | 6901.798 | 7801.183 | 8562.859 | 18154.044 | 13040.142 |
| 294.0 | 30242.815 | 10892.615 | 10275.39 | 18990.601 | 31680 | 18530.318 | 21003.158 | 11666.123 | 9638.914 | 6896.123 | 7794.781 | 8556.834 | 18137.994 | 13036.042 |
| 295.0 | 30242.815 | 10885.821 | 10266.945 | 18990.601 | 31680 | 18530.318 | 20993.656 | 11663.408 | 9638.914 | 6890.362 | 7787.113 | 8549.315 | 18122.026 | 13031.958 |
| 296.0 | 30242.815 | 10879.036 | 10258.543 | 18983.288 | 31680 | 18530.318 | 20984.196 | 11660.694 | 9638.914 | 6884.799 | 7780.734 | 8541.809 | 18106.141 | 13027.891 |
| 297.0 | 30242.815 | 10872.259 | 10250.182 | 18983.288 | 31680 | 18530.318 | 20974.776 | 11657.98 | 9638.914 | 6879.151 | 7773.093 | 8535.813 | 18090.337 | 13023.84 |
| 298.0 | 30242.815 | 10865.491 | 10241.864 | 18983.288 | 31680 | 18530.318 | 20965.396 | 11655.269 | 9638.914 | 6873.607 | 7766.738 | 8528.331 | 18074.613 | 13019.805 |
| 299.0 | 30242.815 | 10858.731 | 10233.586 | 18975.982 | 31680 | 18530.318 | 20956.055 | 11652.558 | 9638.914 | 6867.977 | 7759.124 | 8520.862 | 18058.969 | 13015.786 |
| 300.0 | 30242.815 | 10851.979 | 10225.349 | 18975.982 | 31680 | 18530.318 | 20946.754 | 11649.849 | 9638.914 | 6862.45 | 7752.791 | 8514.896 | 18043.404 | 13011.783 |